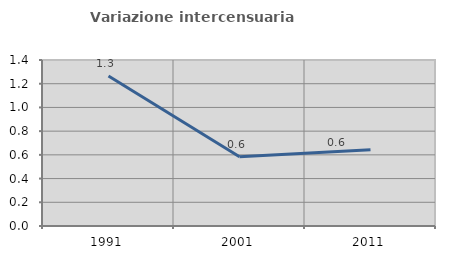
| Category | Variazione intercensuaria annua |
|---|---|
| 1991.0 | 1.265 |
| 2001.0 | 0.584 |
| 2011.0 | 0.642 |